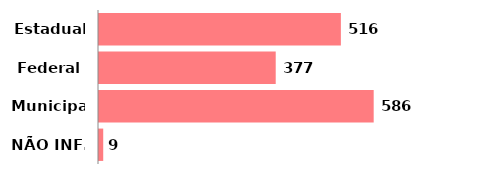
| Category | Qtde |
|---|---|
| Estadual | 516 |
| Federal | 377 |
| Municipal | 586 |
| NÃO INF. | 9 |